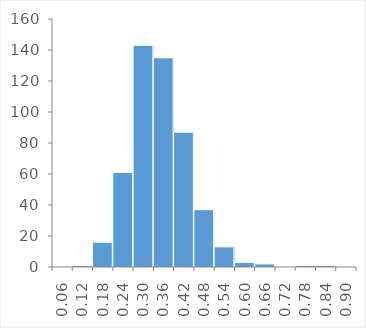
| Category | 'Page 8'!$K$10; n=0 |
|---|---|
| 0.06 | 0 |
| 0.12 | 1 |
| 0.18 | 16 |
| 0.24 | 61 |
| 0.3 | 143 |
| 0.36 | 135 |
| 0.42 | 87 |
| 0.48 | 37 |
| 0.54 | 13 |
| 0.6000000000000001 | 3 |
| 0.6599999999999999 | 2 |
| 0.72 | 0 |
| 0.78 | 1 |
| 0.8400000000000001 | 1 |
| 0.8999999999999999 | 0 |